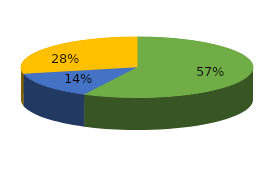
| Category | Series 0 |
|---|---|
| 0 | 4.7 |
| 1 | 1.147 |
| 2 | 2.33 |